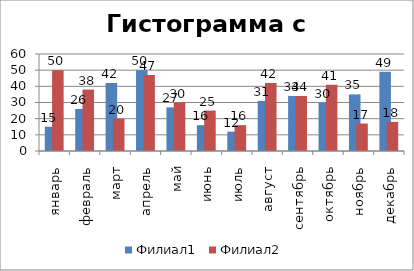
| Category | Филиал1 | Филиал2 |
|---|---|---|
| январь | 15 | 50 |
| февраль | 26 | 38 |
| март | 42 | 20 |
| апрель | 50 | 47 |
| май | 27 | 30 |
| июнь | 16 | 25 |
| июль | 12 | 16 |
| август | 31 | 42 |
| сентябрь | 34 | 34 |
| октябрь | 30 | 41 |
| ноябрь | 35 | 17 |
| декабрь | 49 | 18 |